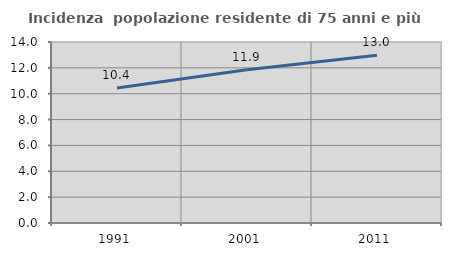
| Category | Incidenza  popolazione residente di 75 anni e più |
|---|---|
| 1991.0 | 10.434 |
| 2001.0 | 11.859 |
| 2011.0 | 12.97 |